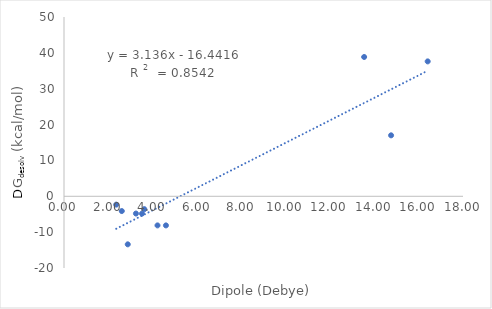
| Category | Series 0 |
|---|---|
| 4.2183 | -8.12 |
| 2.8765 | -13.4 |
| 2.6072 | -4.12 |
| 14.7561 | 17 |
| 4.5986 | -8.12 |
| 3.5183 | -4.84 |
| 3.2457 | -4.81 |
| 16.407 | 37.62 |
| 2.3575 | -2.33 |
| 13.5405 | 38.85 |
| 3.6221 | -3.59 |